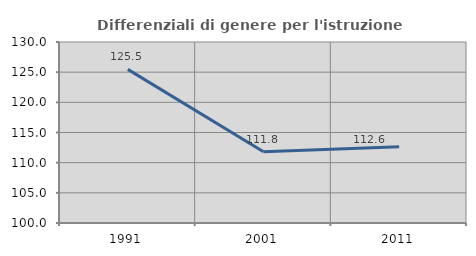
| Category | Differenziali di genere per l'istruzione superiore |
|---|---|
| 1991.0 | 125.46 |
| 2001.0 | 111.81 |
| 2011.0 | 112.628 |